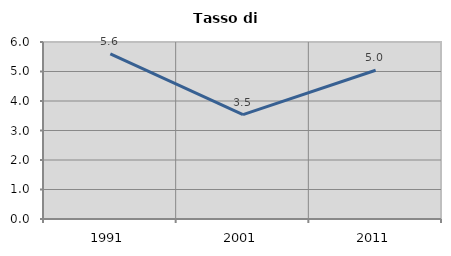
| Category | Tasso di disoccupazione   |
|---|---|
| 1991.0 | 5.597 |
| 2001.0 | 3.54 |
| 2011.0 | 5.042 |